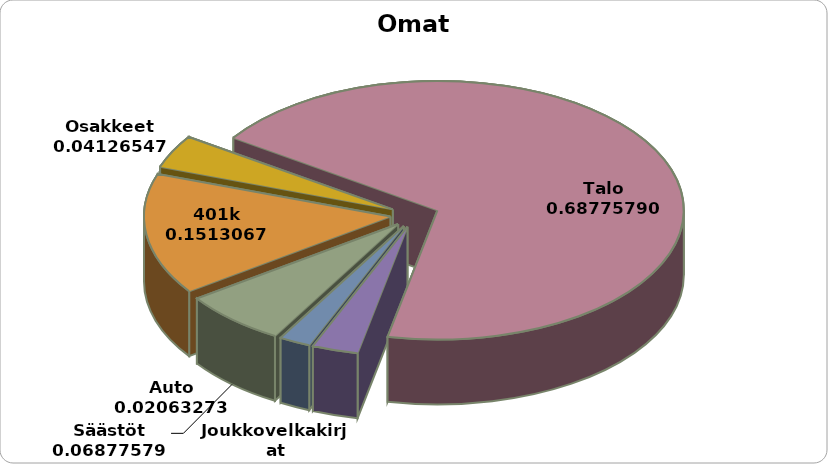
| Category | Summa |
|---|---|
| Säästöt | 25000 |
| 401k | 55000 |
| Osakkeet | 15000 |
| Talo | 250000 |
| Joukkovelkakirjat | 11000 |
| Auto | 7500 |